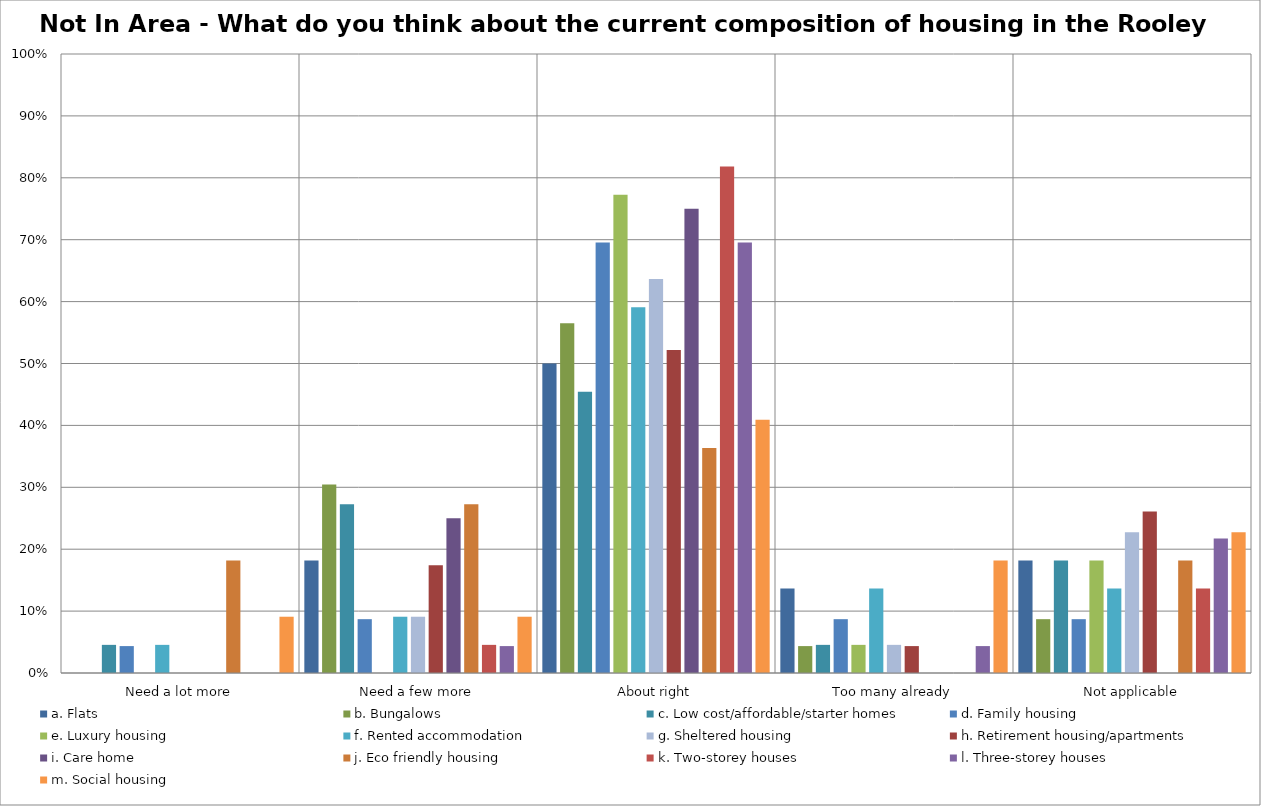
| Category | a. Flats | b. Bungalows | c. Low cost/affordable/starter homes | d. Family housing | e. Luxury housing | f. Rented accommodation | g. Sheltered housing | h. Retirement housing/apartments | i. Care home | j. Eco friendly housing | k. Two-storey houses | l. Three-storey houses | m. Social housing |
|---|---|---|---|---|---|---|---|---|---|---|---|---|---|
| Need a lot more | 0 | 0 | 0.045 | 0.043 | 0 | 0.045 | 0 | 0 | 0 | 0.182 | 0 | 0 | 0.091 |
| Need a few more | 0.182 | 0.304 | 0.273 | 0.087 | 0 | 0.091 | 0.091 | 0.174 | 0.25 | 0.273 | 0.045 | 0.043 | 0.091 |
| About right | 0.5 | 0.565 | 0.455 | 0.696 | 0.773 | 0.591 | 0.636 | 0.522 | 0.75 | 0.364 | 0.818 | 0.696 | 0.409 |
| Too many already | 0.136 | 0.043 | 0.045 | 0.087 | 0.045 | 0.136 | 0.045 | 0.043 | 0 | 0 | 0 | 0.043 | 0.182 |
| Not applicable | 0.182 | 0.087 | 0.182 | 0.087 | 0.182 | 0.136 | 0.227 | 0.261 | 0 | 0.182 | 0.136 | 0.217 | 0.227 |